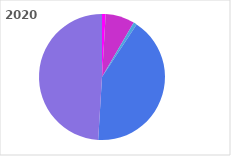
| Category | 2020 |
|---|---|
| Apprentissage | 0.933 |
| Enseignement à distance | 7.476 |
| Formation continue | 0.856 |
| Individuel | 41.706 |
| Scolaire | 49.029 |